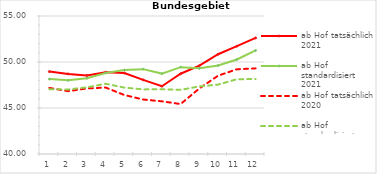
| Category | ab Hof tatsächlich 2021 | ab Hof standardisiert 2021 | ab Hof tatsächlich 2020 | ab Hof standardisiert 2020 |
|---|---|---|---|---|
| 0 | 48.957 | 48.146 | 47.181 | 47.038 |
| 1 | 48.706 | 48.006 | 46.829 | 47.015 |
| 2 | 48.532 | 48.24 | 47.127 | 47.247 |
| 3 | 48.887 | 48.809 | 47.223 | 47.636 |
| 4 | 48.801 | 49.12 | 46.413 | 47.216 |
| 5 | 48.058 | 49.225 | 45.922 | 47.023 |
| 6 | 47.365 | 48.74 | 45.725 | 47.033 |
| 7 | 48.722 | 49.439 | 45.43 | 46.97 |
| 8 | 49.599 | 49.312 | 47.124 | 47.35 |
| 9 | 50.845 | 49.618 | 48.514 | 47.545 |
| 10 | 51.717 | 50.277 | 49.21 | 48.126 |
| 11 | 52.615 | 51.254 | 49.309 | 48.15 |